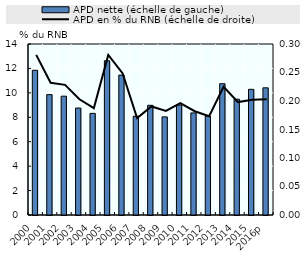
| Category | APD nette (échelle de gauche) |
|---|---|
| 2000 | 11848.555 |
| 2001 | 9854.124 |
| 2002 | 9728.624 |
| 2003 | 8757.305 |
| 2004 | 8320.741 |
| 2005 | 12628.913 |
| 2006 | 11453.465 |
| 2007 | 8085.553 |
| 2008 | 8980.042 |
| 2009 | 8032.043 |
| 2010 | 9002.771 |
| 2011 | 8357.309 |
| 2012 | 8083.651 |
| 2013 | 10748.762 |
| 2014 | 9483.29 |
| 2015 | 10286.901 |
| 2016p | 10411.577 |